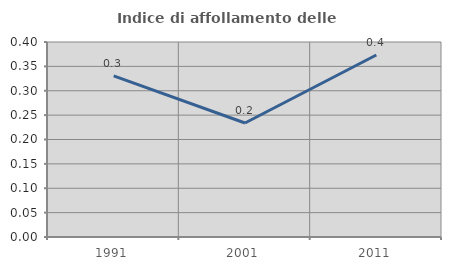
| Category | Indice di affollamento delle abitazioni  |
|---|---|
| 1991.0 | 0.33 |
| 2001.0 | 0.234 |
| 2011.0 | 0.373 |